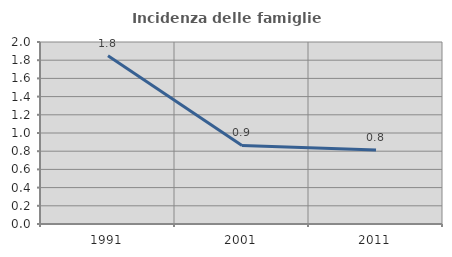
| Category | Incidenza delle famiglie numerose |
|---|---|
| 1991.0 | 1.848 |
| 2001.0 | 0.863 |
| 2011.0 | 0.813 |